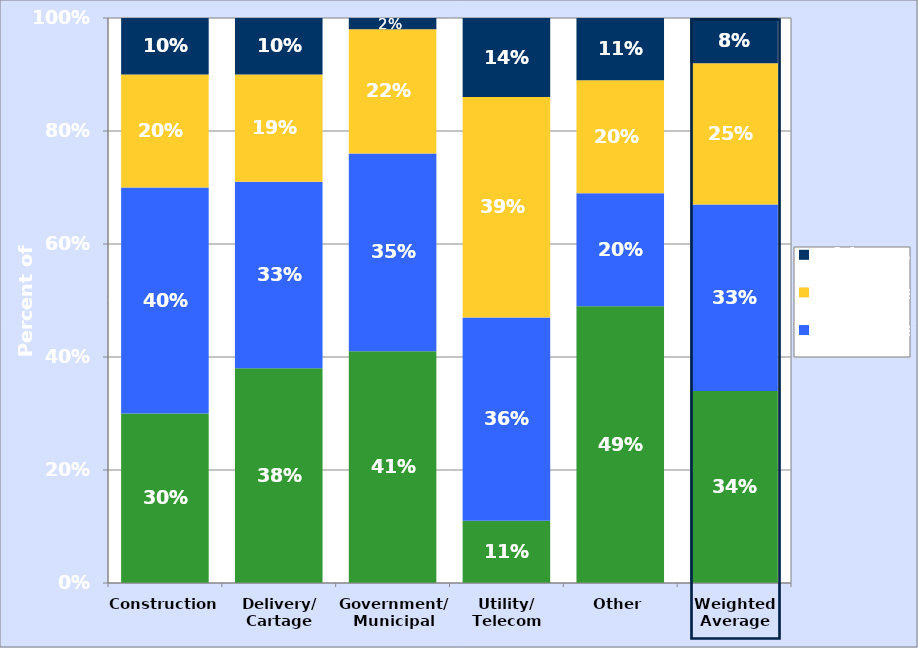
| Category | <1 hour | 1-2 hours | 3-4 hours | >4 hours |
|---|---|---|---|---|
| Construction | 0.3 | 0.4 | 0.2 | 0.1 |
| Delivery/
Cartage | 0.38 | 0.33 | 0.19 | 0.1 |
| Government/
Municipal | 0.41 | 0.35 | 0.22 | 0.02 |
| Utility/
Telecom | 0.11 | 0.36 | 0.39 | 0.14 |
| Other | 0.49 | 0.2 | 0.2 | 0.11 |
| Weighted Average | 0.34 | 0.33 | 0.25 | 0.08 |